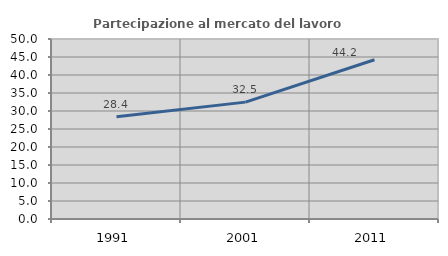
| Category | Partecipazione al mercato del lavoro  femminile |
|---|---|
| 1991.0 | 28.405 |
| 2001.0 | 32.463 |
| 2011.0 | 44.237 |